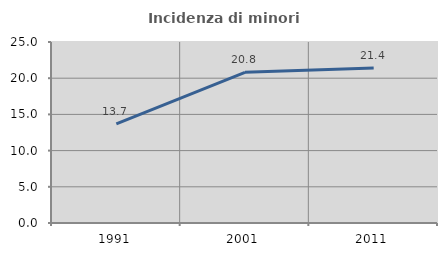
| Category | Incidenza di minori stranieri |
|---|---|
| 1991.0 | 13.684 |
| 2001.0 | 20.809 |
| 2011.0 | 21.415 |